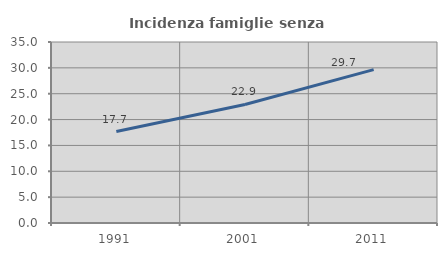
| Category | Incidenza famiglie senza nuclei |
|---|---|
| 1991.0 | 17.683 |
| 2001.0 | 22.919 |
| 2011.0 | 29.651 |